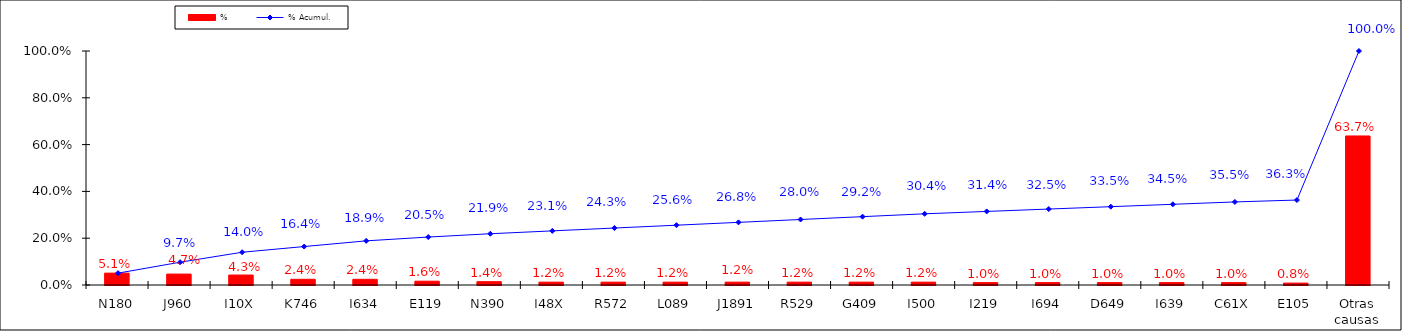
| Category | % |
|---|---|
| N180 | 0.051 |
| J960 | 0.047 |
| I10X | 0.043 |
| K746 | 0.024 |
| I634 | 0.024 |
| E119 | 0.016 |
| N390 | 0.014 |
| I48X | 0.012 |
| R572 | 0.012 |
| L089 | 0.012 |
| J1891 | 0.012 |
| R529 | 0.012 |
| G409 | 0.012 |
| I500 | 0.012 |
| I219 | 0.01 |
| I694 | 0.01 |
| D649 | 0.01 |
| I639 | 0.01 |
| C61X | 0.01 |
| E105 | 0.008 |
| Otras causas | 0.637 |